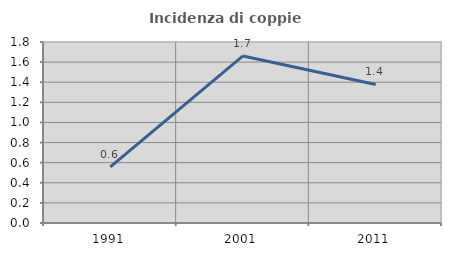
| Category | Incidenza di coppie miste |
|---|---|
| 1991.0 | 0.559 |
| 2001.0 | 1.662 |
| 2011.0 | 1.377 |